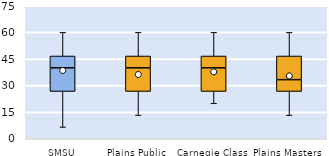
| Category | 25th | 50th | 75th |
|---|---|---|---|
| SMSU | 26.667 | 13.333 | 6.667 |
| Plains Public | 26.667 | 13.333 | 6.667 |
| Carnegie Class | 26.667 | 13.333 | 6.667 |
| Plains Masters | 26.667 | 6.667 | 13.333 |